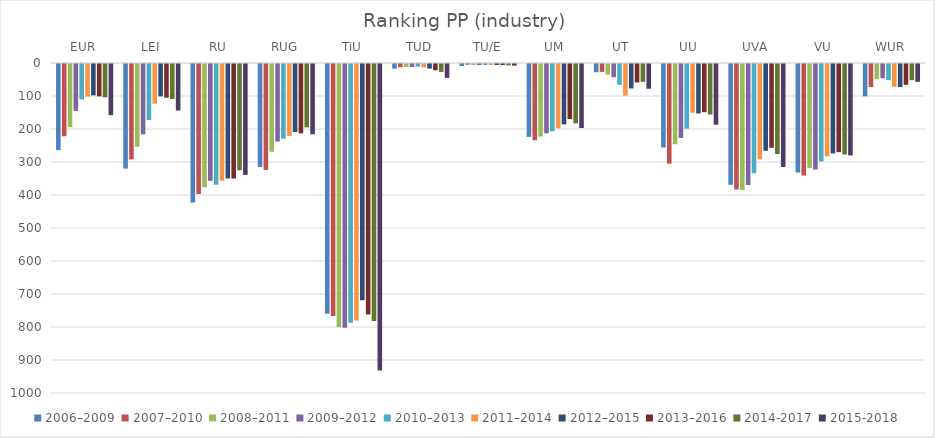
| Category | 2006–2009 | 2007–2010 | 2008–2011 | 2009–2012 | 2010–2013 | 2011–2014 | 2012–2015 | 2013–2016 | 2014-2017 | 2015-2018 |
|---|---|---|---|---|---|---|---|---|---|---|
| EUR | 261 | 219 | 191 | 142 | 107 | 99 | 95 | 98 | 101 | 155 |
| LEI | 317 | 289 | 251 | 213 | 170 | 120 | 98 | 102 | 106 | 141 |
| RU | 420 | 394 | 374 | 354 | 366 | 354 | 347 | 347 | 322 | 336 |
| RUG | 312 | 321 | 266 | 235 | 226 | 218 | 206 | 210 | 192 | 213 |
| TiU | 757 | 764 | 798 | 799 | 784 | 777 | 716 | 759 | 779 | 929 |
| TUD | 14 | 10 | 9 | 9 | 8 | 10 | 14 | 19 | 24 | 42 |
| TU/E | 6 | 2 | 3 | 3 | 3 | 3 | 3 | 3 | 4 | 5 |
| UM | 221 | 231 | 220 | 210 | 204 | 195 | 183 | 167 | 180 | 194 |
| UT | 25 | 24 | 32 | 40 | 63 | 96 | 74 | 56 | 54 | 75 |
| UU | 253 | 302 | 243 | 224 | 196 | 148 | 150 | 146 | 153 | 184 |
| UVA | 366 | 380 | 382 | 367 | 331 | 289 | 263 | 254 | 273 | 312 |
| VU | 329 | 338 | 315 | 320 | 295 | 280 | 271 | 267 | 274 | 277 |
| WUR | 98 | 70 | 46 | 43 | 49 | 69 | 70 | 63 | 49 | 54 |